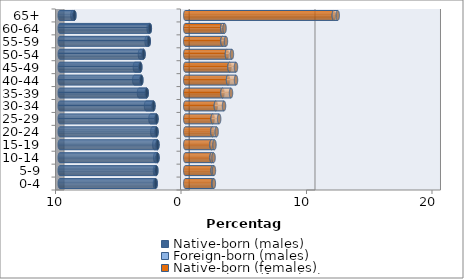
| Category | Native-born (males) | Foreign-born (males) | Native-born (females) | Foreign-born (females) |
|---|---|---|---|---|
| 0-4 | -2.357 | -0.059 | 2.225 | 0.055 |
| 5-9 | -2.306 | -0.108 | 2.186 | 0.099 |
| 10-14 | -2.213 | -0.177 | 2.095 | 0.162 |
| 15-19 | -2.216 | -0.252 | 2.092 | 0.237 |
| 20-24 | -2.292 | -0.336 | 2.162 | 0.337 |
| 25-29 | -2.293 | -0.481 | 2.186 | 0.514 |
| 30-34 | -2.534 | -0.589 | 2.44 | 0.65 |
| 35-39 | -3.071 | -0.616 | 2.966 | 0.681 |
| 40-44 | -3.499 | -0.565 | 3.409 | 0.636 |
| 45-49 | -3.583 | -0.429 | 3.525 | 0.518 |
| 50-54 | -3.325 | -0.289 | 3.321 | 0.398 |
| 55-59 | -2.909 | -0.171 | 2.964 | 0.279 |
| 60-64 | -2.821 | -0.097 | 2.955 | 0.176 |
| 65+ | -8.837 | -0.155 | 11.837 | 0.314 |